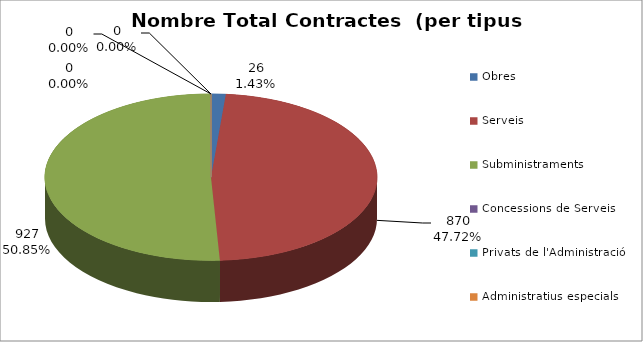
| Category | Nombre Total Contractes |
|---|---|
| Obres | 26 |
| Serveis | 870 |
| Subministraments | 927 |
| Concessions de Serveis | 0 |
| Privats de l'Administració | 0 |
| Administratius especials | 0 |